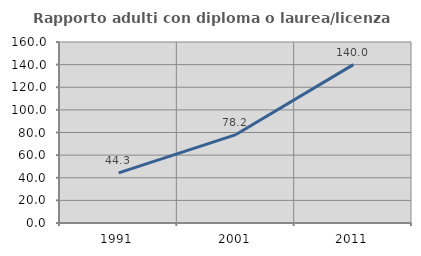
| Category | Rapporto adulti con diploma o laurea/licenza media  |
|---|---|
| 1991.0 | 44.334 |
| 2001.0 | 78.171 |
| 2011.0 | 139.966 |